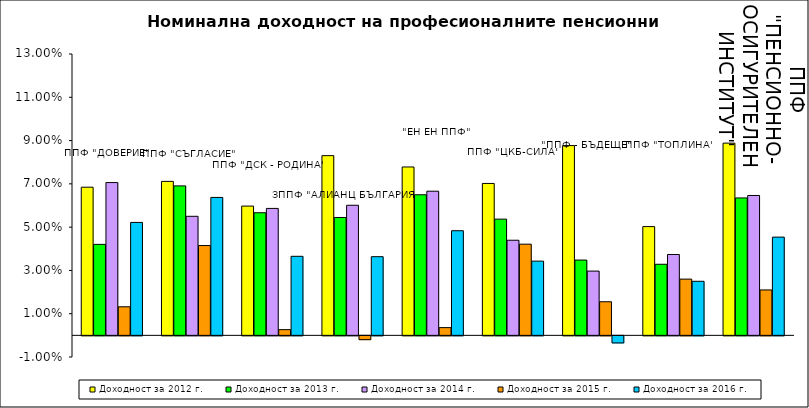
| Category | Доходност за 2012 г. | Доходност за 2013 г. | Доходност за 2014 г. | Доходност за 2015 г. | Доходност за 2016 г. |
|---|---|---|---|---|---|
| ППФ "ДОВЕРИЕ"  | 0.068 | 0.042 | 0.071 | 0.013 | 0.052 |
| ППФ "СЪГЛАСИЕ"  | 0.071 | 0.069 | 0.055 | 0.042 | 0.064 |
| ППФ "ДСК - РОДИНА" | 0.06 | 0.057 | 0.059 | 0.003 | 0.037 |
| ЗППФ "АЛИАНЦ БЪЛГАРИЯ" | 0.083 | 0.054 | 0.06 | -0.002 | 0.036 |
| "ЕН ЕН ППФ" | 0.078 | 0.065 | 0.067 | 0.004 | 0.048 |
| ППФ "ЦКБ-СИЛА" | 0.07 | 0.054 | 0.044 | 0.042 | 0.034 |
| "ППФ - БЪДЕЩЕ" | 0.088 | 0.035 | 0.03 | 0.016 | -0.003 |
| ППФ "ТОПЛИНА" | 0.05 | 0.033 | 0.037 | 0.026 | 0.025 |
| ППФ "ПЕНСИОННООСИГУРИТЕЛЕН ИНСТИТУТ" | 0.089 | 0.063 | 0.065 | 0.021 | 0.045 |